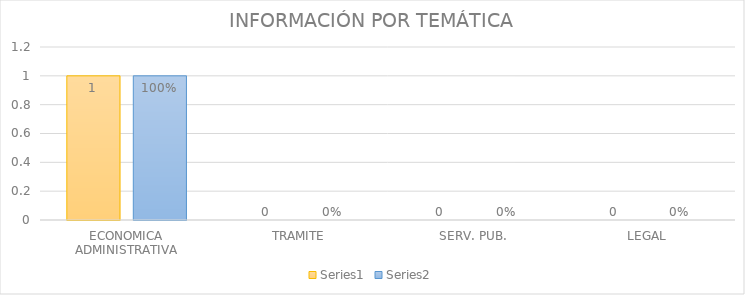
| Category | Series 3 | Series 4 |
|---|---|---|
| ECONOMICA ADMINISTRATIVA | 1 | 1 |
| TRAMITE | 0 | 0 |
| SERV. PUB. | 0 | 0 |
| LEGAL | 0 | 0 |